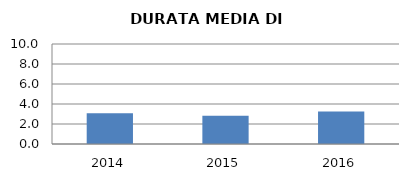
| Category | 2014 2015 2016 |
|---|---|
| 2014.0 | 3.068 |
| 2015.0 | 2.836 |
| 2016.0 | 3.255 |